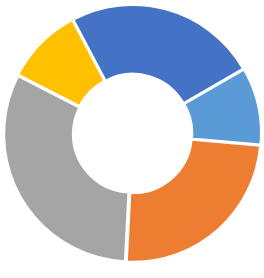
| Category | Series 0 |
|---|---|
| 0 | 0.098 |
| 1 | 0.244 |
| 2 | 0.317 |
| 3 | 0.098 |
| 4 | 0.244 |
| 5 | 0 |
| 6 | 0 |
| 7 | 0 |
| 8 | 0 |
| 9 | 0 |